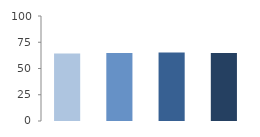
| Category | Rate (%) |
|---|---|
| 2009.0 | 64.286 |
| 2010.0 | 64.8 |
| 2011.0 | 65.161 |
| 2012.0 | 64.678 |